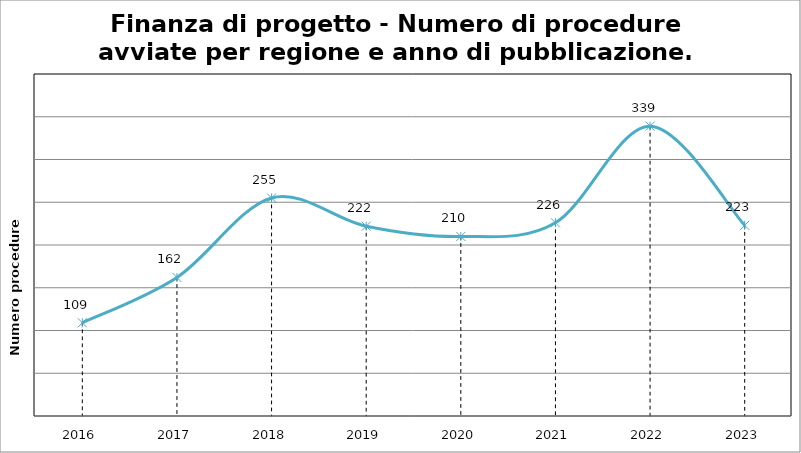
| Category | Totale |
|---|---|
| 2016.0 | 109 |
| 2017.0 | 162 |
| 2018.0 | 255 |
| 2019.0 | 222 |
| 2020.0 | 210 |
| 2021.0 | 226 |
| 2022.0 | 339 |
| 2023.0 | 223 |